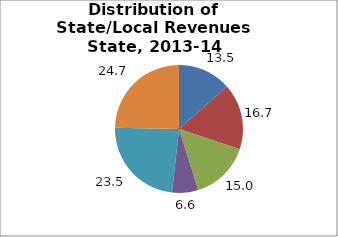
| Category | Series 0 |
|---|---|
| General Sales | 13.461 |
| Property | 16.668 |
| Income1 | 15.042 |
| Other | 6.585 |
| From Federal Government | 23.53 |
| Nontax Revenues2 | 24.714 |